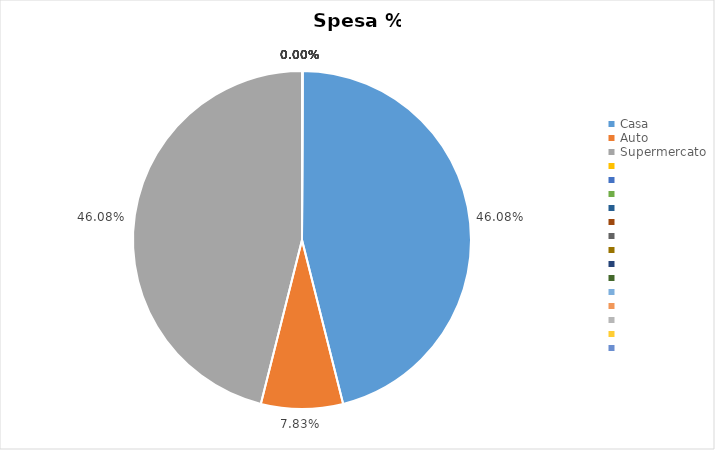
| Category | Spesa % |
|---|---|
| Casa | 0.461 |
| Auto | 0.078 |
| Supermercato | 0.461 |